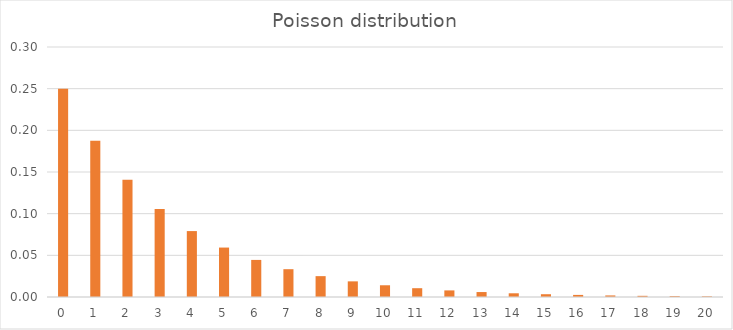
| Category | Poisson |
|---|---|
| 0.0 | 0.25 |
| 1.0 | 0.188 |
| 2.0 | 0.141 |
| 3.0 | 0.105 |
| 4.0 | 0.079 |
| 5.0 | 0.059 |
| 6.0 | 0.044 |
| 7.0 | 0.033 |
| 8.0 | 0.025 |
| 9.0 | 0.019 |
| 10.0 | 0.014 |
| 11.0 | 0.011 |
| 12.0 | 0.008 |
| 13.0 | 0.006 |
| 14.0 | 0.004 |
| 15.0 | 0.003 |
| 16.0 | 0.003 |
| 17.0 | 0.002 |
| 18.0 | 0.001 |
| 19.0 | 0.001 |
| 20.0 | 0.001 |